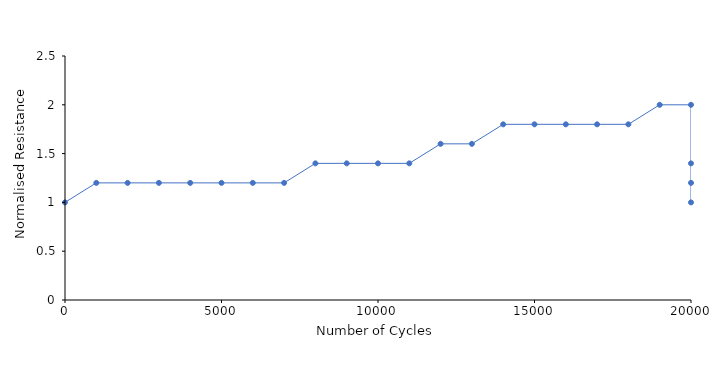
| Category | Normalised |
|---|---|
| 0.0 | 1 |
| 1000.0 | 1.2 |
| 2000.0 | 1.2 |
| 3000.0 | 1.2 |
| 4000.0 | 1.2 |
| 5000.0 | 1.2 |
| 6000.0 | 1.2 |
| 7000.0 | 1.2 |
| 8000.0 | 1.4 |
| 9000.0 | 1.4 |
| 10000.0 | 1.4 |
| 11000.0 | 1.4 |
| 12000.0 | 1.6 |
| 13000.0 | 1.6 |
| 14000.0 | 1.8 |
| 15000.0 | 1.8 |
| 16000.0 | 1.8 |
| 17000.0 | 1.8 |
| 18000.0 | 1.8 |
| 19000.0 | 2 |
| 20000.0 | 2 |
| 20000.0 | 1.4 |
| 20000.0 | 1.2 |
| 20000.0 | 1 |